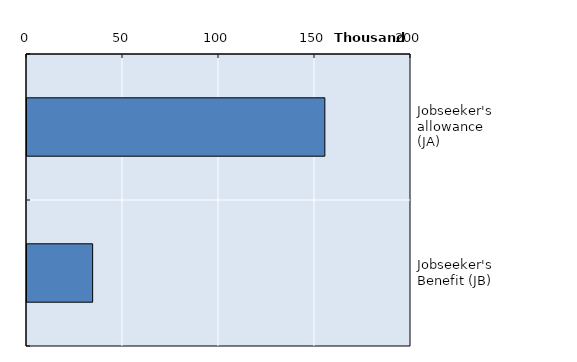
| Category | Series 0 |
|---|---|
| Jobseeker's allowance (JA) | 155133 |
| Jobseeker's Benefit (JB) | 34189 |